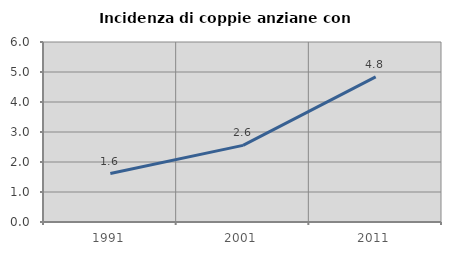
| Category | Incidenza di coppie anziane con figli |
|---|---|
| 1991.0 | 1.616 |
| 2001.0 | 2.555 |
| 2011.0 | 4.836 |